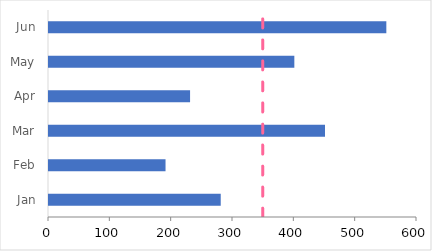
| Category | Order |
|---|---|
| Jan | 280 |
| Feb | 190 |
| Mar | 450 |
| Apr | 230 |
| May | 400 |
| Jun | 550 |